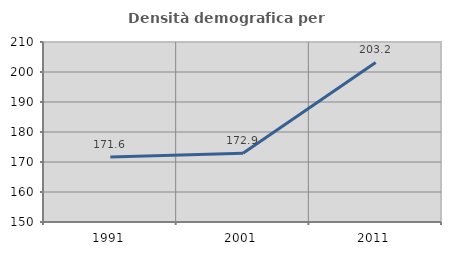
| Category | Densità demografica |
|---|---|
| 1991.0 | 171.632 |
| 2001.0 | 172.943 |
| 2011.0 | 203.179 |